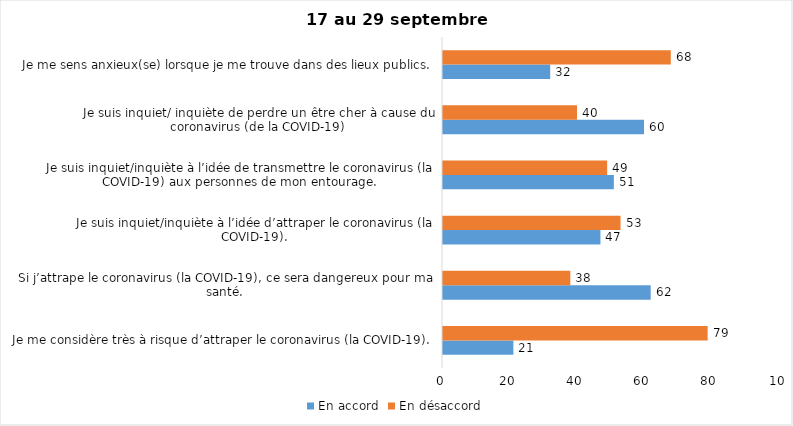
| Category | En accord | En désaccord |
|---|---|---|
| Je me considère très à risque d’attraper le coronavirus (la COVID-19). | 21 | 79 |
| Si j’attrape le coronavirus (la COVID-19), ce sera dangereux pour ma santé. | 62 | 38 |
| Je suis inquiet/inquiète à l’idée d’attraper le coronavirus (la COVID-19). | 47 | 53 |
| Je suis inquiet/inquiète à l’idée de transmettre le coronavirus (la COVID-19) aux personnes de mon entourage. | 51 | 49 |
| Je suis inquiet/ inquiète de perdre un être cher à cause du coronavirus (de la COVID-19) | 60 | 40 |
| Je me sens anxieux(se) lorsque je me trouve dans des lieux publics. | 32 | 68 |